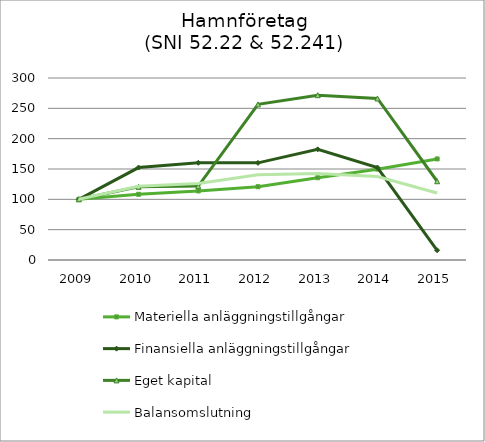
| Category | Materiella anläggningstillgångar | Finansiella anläggningstillgångar | Eget kapital | Balansomslutning |
|---|---|---|---|---|
| 2009.0 | 100 | 100 | 100 | 100 |
| 2010.0 | 108.32 | 152.355 | 120.584 | 121.692 |
| 2011.0 | 113.804 | 160.262 | 121.757 | 125.996 |
| 2012.0 | 120.816 | 160.111 | 256.532 | 140.335 |
| 2013.0 | 135.632 | 182.436 | 271.734 | 142.648 |
| 2014.0 | 149.721 | 152.355 | 266.26 | 137.497 |
| 2015.0 | 166.616 | 16.03 | 129.808 | 110.405 |